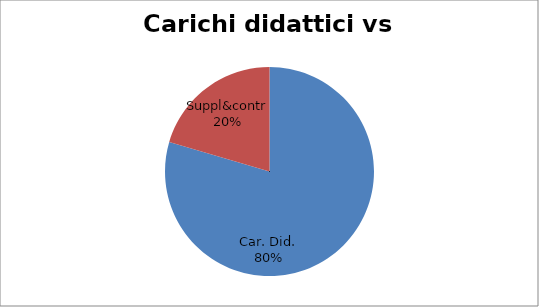
| Category | Series 0 |
|---|---|
| Car. Did. | 0.795 |
| Suppl&contr | 0.205 |